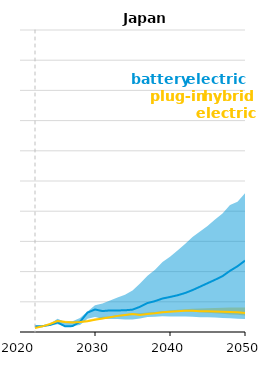
| Category | BEV_ref | PHEV_ref |
|---|---|---|
| 2022.0 | 0.019 | 0.013 |
| 2023.0 | 0.019 | 0.019 |
| 2024.0 | 0.023 | 0.026 |
| 2025.0 | 0.032 | 0.036 |
| 2026.0 | 0.019 | 0.033 |
| 2027.0 | 0.02 | 0.031 |
| 2028.0 | 0.034 | 0.033 |
| 2029.0 | 0.064 | 0.036 |
| 2030.0 | 0.075 | 0.041 |
| 2031.0 | 0.069 | 0.044 |
| 2032.0 | 0.071 | 0.049 |
| 2033.0 | 0.071 | 0.053 |
| 2034.0 | 0.072 | 0.056 |
| 2035.0 | 0.074 | 0.06 |
| 2036.0 | 0.083 | 0.057 |
| 2037.0 | 0.096 | 0.059 |
| 2038.0 | 0.102 | 0.062 |
| 2039.0 | 0.111 | 0.065 |
| 2040.0 | 0.116 | 0.067 |
| 2041.0 | 0.122 | 0.069 |
| 2042.0 | 0.129 | 0.07 |
| 2043.0 | 0.139 | 0.07 |
| 2044.0 | 0.15 | 0.069 |
| 2045.0 | 0.161 | 0.068 |
| 2046.0 | 0.173 | 0.068 |
| 2047.0 | 0.185 | 0.067 |
| 2048.0 | 0.203 | 0.067 |
| 2049.0 | 0.218 | 0.065 |
| 2050.0 | 0.236 | 0.063 |